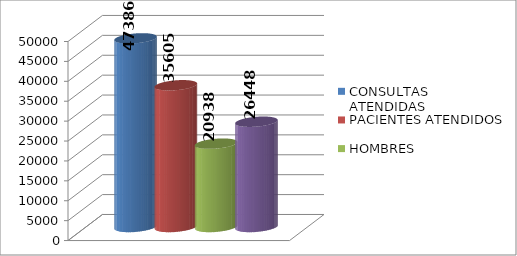
| Category | CONSULTAS ATENDIDAS  | PACIENTES ATENDIDOS | HOMBRES  | MUJERES |
|---|---|---|---|---|
| 0 | 47386 | 35605 | 20938 | 26448 |